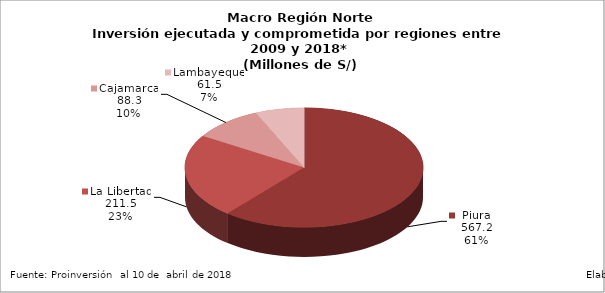
| Category | Series 0 |
|---|---|
| Piura | 567.205 |
| La Libertad | 211.496 |
| Cajamarca | 88.308 |
| Lambayeque | 61.503 |